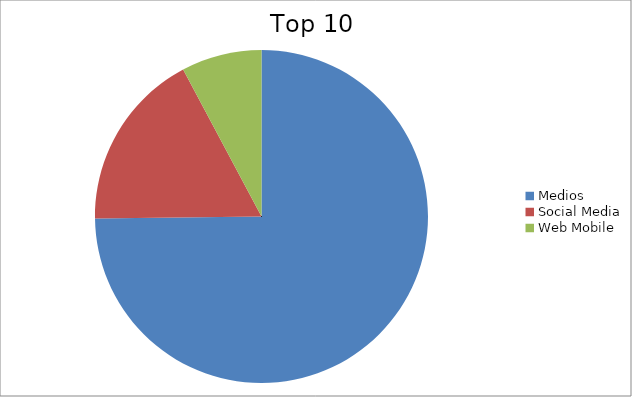
| Category | Series 0 |
|---|---|
| Medios | 74.8 |
| Social Media | 17.4 |
| Web Mobile | 7.8 |